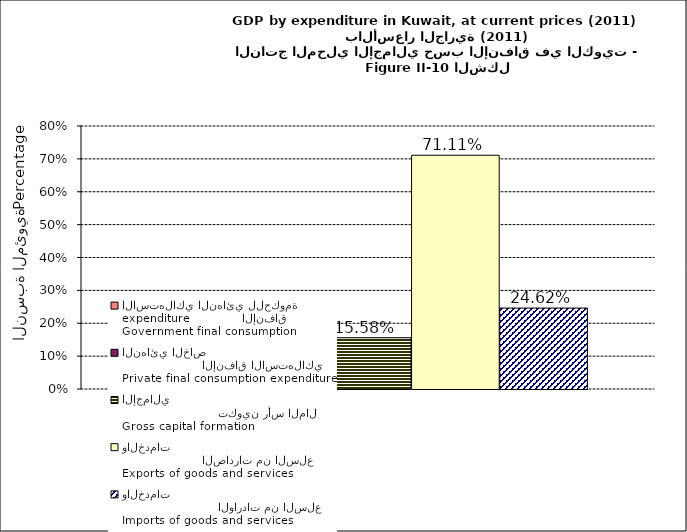
| Category | Government final consumption expenditure             الإنفاق الاستهلاكي النهائي للحكومة | Private final consumption expenditure                     الإنفاق الاستهلاكي النهائي الخاص | Gross capital formation                                                 تكوين رأس المال الإجمالي         | Exports of goods and services                                  الصادرات من السلع والخدمات | Imports of goods and services                                      الواردات من السلع والخدمات |
|---|---|---|---|---|---|
| 0 | 0.151 | 0.228 | 0.156 | 0.711 | 0.246 |